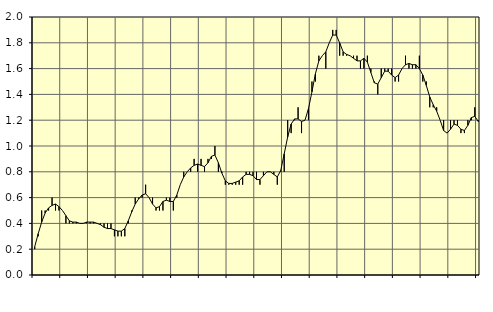
| Category | Piggar | Anställda utomlands |
|---|---|---|
| nan | 0.2 | 0.22 |
| 87.0 | 0.3 | 0.32 |
| 87.0 | 0.5 | 0.41 |
| 87.0 | 0.5 | 0.48 |
| nan | 0.5 | 0.52 |
| 88.0 | 0.6 | 0.54 |
| 88.0 | 0.5 | 0.55 |
| 88.0 | 0.5 | 0.53 |
| nan | 0.5 | 0.5 |
| 89.0 | 0.4 | 0.46 |
| 89.0 | 0.4 | 0.42 |
| 89.0 | 0.4 | 0.41 |
| nan | 0.4 | 0.41 |
| 90.0 | 0.4 | 0.4 |
| 90.0 | 0.4 | 0.4 |
| 90.0 | 0.4 | 0.41 |
| nan | 0.4 | 0.41 |
| 91.0 | 0.4 | 0.41 |
| 91.0 | 0.4 | 0.4 |
| 91.0 | 0.4 | 0.39 |
| nan | 0.4 | 0.37 |
| 92.0 | 0.4 | 0.36 |
| 92.0 | 0.4 | 0.36 |
| 92.0 | 0.3 | 0.35 |
| nan | 0.3 | 0.34 |
| 93.0 | 0.3 | 0.34 |
| 93.0 | 0.3 | 0.36 |
| 93.0 | 0.4 | 0.42 |
| nan | 0.5 | 0.49 |
| 94.0 | 0.6 | 0.55 |
| 94.0 | 0.6 | 0.59 |
| 94.0 | 0.6 | 0.62 |
| nan | 0.7 | 0.63 |
| 95.0 | 0.6 | 0.6 |
| 95.0 | 0.6 | 0.55 |
| 95.0 | 0.5 | 0.52 |
| nan | 0.5 | 0.53 |
| 96.0 | 0.5 | 0.57 |
| 96.0 | 0.6 | 0.58 |
| 96.0 | 0.6 | 0.57 |
| nan | 0.5 | 0.57 |
| 97.0 | 0.6 | 0.62 |
| 97.0 | 0.7 | 0.7 |
| 97.0 | 0.8 | 0.76 |
| nan | 0.8 | 0.8 |
| 98.0 | 0.8 | 0.83 |
| 98.0 | 0.9 | 0.85 |
| 98.0 | 0.8 | 0.86 |
| nan | 0.9 | 0.85 |
| 99.0 | 0.8 | 0.84 |
| 99.0 | 0.9 | 0.87 |
| 99.0 | 0.9 | 0.92 |
| nan | 1 | 0.93 |
| 0.0 | 0.8 | 0.87 |
| 0.0 | 0.8 | 0.79 |
| 0.0 | 0.7 | 0.73 |
| nan | 0.7 | 0.71 |
| 1.0 | 0.7 | 0.71 |
| 1.0 | 0.7 | 0.72 |
| 1.0 | 0.7 | 0.73 |
| nan | 0.7 | 0.76 |
| 2.0 | 0.8 | 0.78 |
| 2.0 | 0.8 | 0.78 |
| 2.0 | 0.8 | 0.77 |
| nan | 0.8 | 0.74 |
| 3.0 | 0.7 | 0.74 |
| 3.0 | 0.8 | 0.77 |
| 3.0 | 0.8 | 0.8 |
| nan | 0.8 | 0.8 |
| 4.0 | 0.8 | 0.78 |
| 4.0 | 0.7 | 0.76 |
| 4.0 | 0.8 | 0.81 |
| nan | 0.8 | 0.94 |
| 5.0 | 1.2 | 1.07 |
| 5.0 | 1.1 | 1.17 |
| 5.0 | 1.2 | 1.21 |
| nan | 1.3 | 1.21 |
| 6.0 | 1.1 | 1.19 |
| 6.0 | 1.2 | 1.2 |
| 6.0 | 1.2 | 1.29 |
| nan | 1.5 | 1.42 |
| 7.0 | 1.5 | 1.56 |
| 7.0 | 1.7 | 1.66 |
| 7.0 | 1.7 | 1.7 |
| nan | 1.6 | 1.73 |
| 8.0 | 1.8 | 1.8 |
| 8.0 | 1.9 | 1.86 |
| 8.0 | 1.9 | 1.86 |
| nan | 1.7 | 1.8 |
| 9.0 | 1.7 | 1.73 |
| 9.0 | 1.7 | 1.71 |
| 9.0 | 1.7 | 1.7 |
| nan | 1.7 | 1.68 |
| 10.0 | 1.7 | 1.66 |
| 10.0 | 1.6 | 1.66 |
| 10.0 | 1.6 | 1.68 |
| nan | 1.7 | 1.65 |
| 11.0 | 1.6 | 1.57 |
| 11.0 | 1.5 | 1.49 |
| 11.0 | 1.4 | 1.48 |
| nan | 1.6 | 1.53 |
| 12.0 | 1.6 | 1.58 |
| 12.0 | 1.6 | 1.58 |
| 12.0 | 1.6 | 1.55 |
| nan | 1.5 | 1.53 |
| 13.0 | 1.5 | 1.55 |
| 13.0 | 1.6 | 1.6 |
| 13.0 | 1.7 | 1.63 |
| nan | 1.6 | 1.64 |
| 14.0 | 1.6 | 1.63 |
| 14.0 | 1.6 | 1.63 |
| 14.0 | 1.7 | 1.6 |
| nan | 1.5 | 1.55 |
| 15.0 | 1.5 | 1.47 |
| 15.0 | 1.3 | 1.38 |
| 15.0 | 1.3 | 1.32 |
| nan | 1.3 | 1.27 |
| 16.0 | 1.2 | 1.2 |
| 16.0 | 1.2 | 1.12 |
| 16.0 | 1.1 | 1.1 |
| nan | 1.2 | 1.13 |
| 17.0 | 1.2 | 1.17 |
| 17.0 | 1.2 | 1.16 |
| 17.0 | 1.1 | 1.13 |
| nan | 1.1 | 1.12 |
| 18.0 | 1.2 | 1.16 |
| 18.0 | 1.2 | 1.22 |
| 18.0 | 1.3 | 1.23 |
| nan | 1.2 | 1.19 |